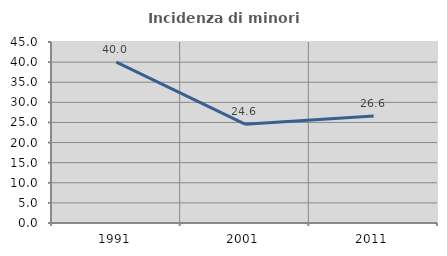
| Category | Incidenza di minori stranieri |
|---|---|
| 1991.0 | 40 |
| 2001.0 | 24.571 |
| 2011.0 | 26.612 |